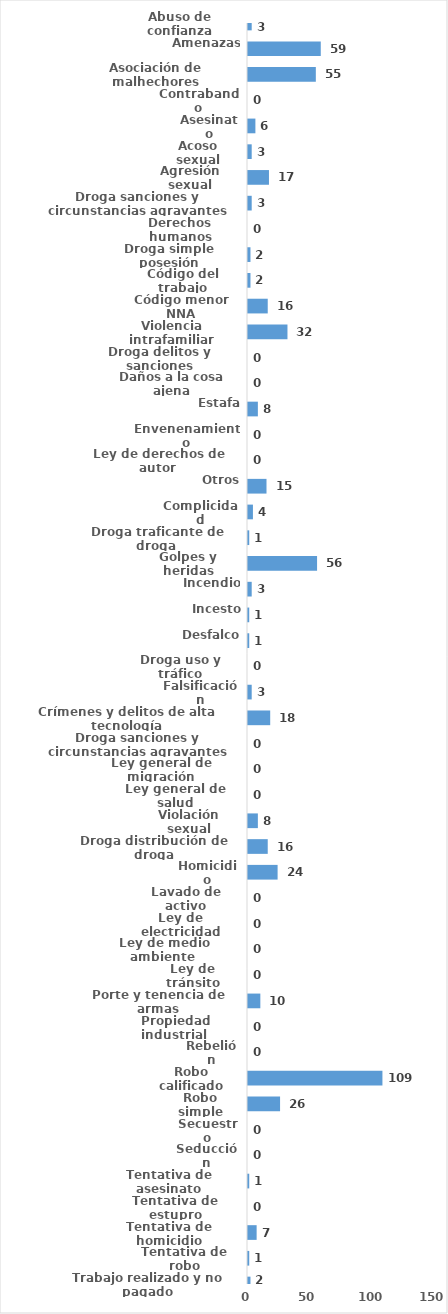
| Category | Series 0 |
|---|---|
| Abuso de confianza | 3 |
| Amenazas | 59 |
| Asociación de malhechores | 55 |
| Contrabando | 0 |
| Asesinato | 6 |
| Acoso sexual | 3 |
| Agresión sexual | 17 |
| Droga sanciones y circunstancias agravantes | 3 |
| Derechos humanos | 0 |
| Droga simple posesión | 2 |
| Código del trabajo | 2 |
| Código menor NNA | 16 |
| Violencia intrafamiliar | 32 |
| Droga delitos y sanciones | 0 |
| Daños a la cosa ajena | 0 |
| Estafa | 8 |
| Envenenamiento | 0 |
| Ley de derechos de autor  | 0 |
| Otros | 15 |
| Complicidad | 4 |
| Droga traficante de droga  | 1 |
| Golpes y heridas | 56 |
| Incendio | 3 |
| Incesto | 1 |
| Desfalco | 1 |
| Droga uso y tráfico | 0 |
| Falsificación | 3 |
| Crímenes y delitos de alta tecnología | 18 |
| Droga sanciones y circunstancias agravantes | 0 |
| Ley general de migración | 0 |
| Ley general de salud | 0 |
| Violación sexual | 8 |
| Droga distribución de droga | 16 |
| Homicidio | 24 |
| Lavado de activo | 0 |
| Ley de electricidad | 0 |
| Ley de medio ambiente  | 0 |
| Ley de tránsito | 0 |
| Porte y tenencia de armas | 10 |
| Propiedad industrial  | 0 |
| Rebelión | 0 |
| Robo calificado | 109 |
| Robo simple | 26 |
| Secuestro | 0 |
| Seducción | 0 |
| Tentativa de asesinato | 1 |
| Tentativa de estupro | 0 |
| Tentativa de homicidio | 7 |
| Tentativa de robo | 1 |
| Trabajo realizado y no pagado | 2 |